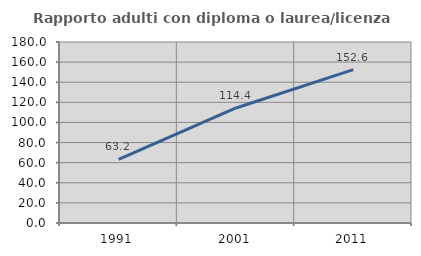
| Category | Rapporto adulti con diploma o laurea/licenza media  |
|---|---|
| 1991.0 | 63.248 |
| 2001.0 | 114.384 |
| 2011.0 | 152.597 |